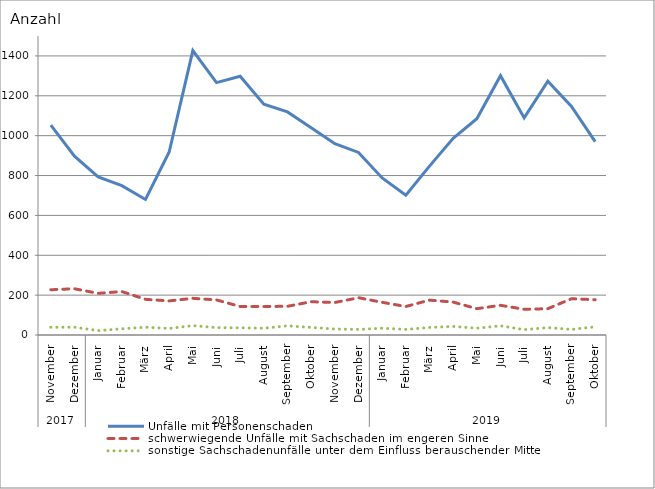
| Category | Unfälle mit Personenschaden | schwerwiegende Unfälle mit Sachschaden im engeren Sinne | sonstige Sachschadenunfälle unter dem Einfluss berauschender Mittel |
|---|---|---|---|
| 0 | 1053 | 227 | 39 |
| 1 | 897 | 232 | 39 |
| 2 | 793 | 209 | 22 |
| 3 | 749 | 218 | 31 |
| 4 | 680 | 179 | 39 |
| 5 | 918 | 171 | 33 |
| 6 | 1427 | 184 | 47 |
| 7 | 1266 | 176 | 37 |
| 8 | 1298 | 143 | 36 |
| 9 | 1158 | 143 | 34 |
| 10 | 1119 | 144 | 46 |
| 11 | 1040 | 167 | 38 |
| 12 | 960 | 163 | 30 |
| 13 | 916 | 187 | 28 |
| 14 | 788 | 164 | 34 |
| 15 | 701 | 143 | 28 |
| 16 | 847 | 175 | 38 |
| 17 | 987 | 165 | 43 |
| 18 | 1085 | 132 | 34 |
| 19 | 1301 | 149 | 46 |
| 20 | 1089 | 129 | 27 |
| 21 | 1273 | 132 | 37 |
| 22 | 1147 | 182 | 28 |
| 23 | 970 | 177 | 41 |